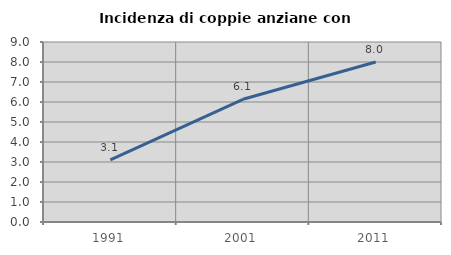
| Category | Incidenza di coppie anziane con figli |
|---|---|
| 1991.0 | 3.106 |
| 2001.0 | 6.135 |
| 2011.0 | 8 |